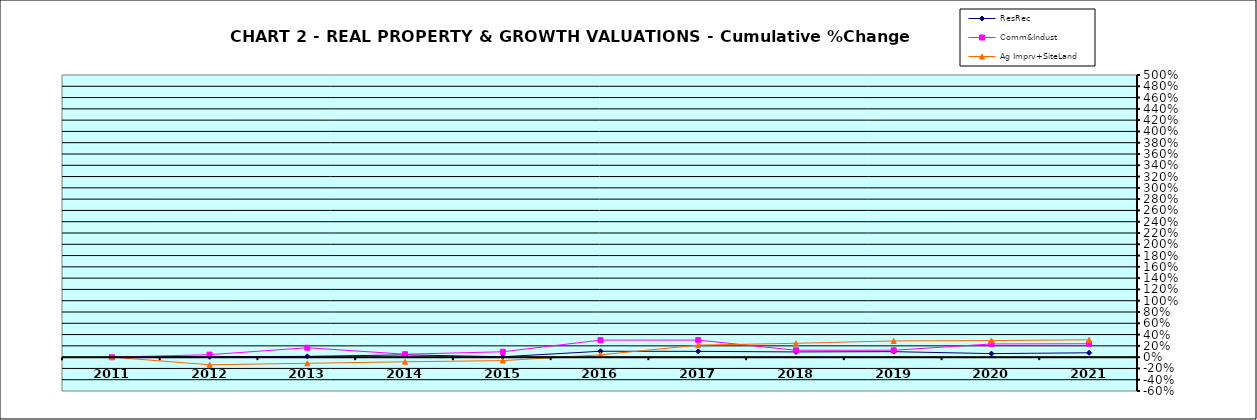
| Category | ResRec | Comm&Indust | Ag Imprv+SiteLand |
|---|---|---|---|
| 2011.0 | -0.001 | -0.001 | 0 |
| 2012.0 | 0.006 | 0.044 | -0.135 |
| 2013.0 | 0.014 | 0.166 | -0.109 |
| 2014.0 | 0.041 | 0.052 | -0.082 |
| 2015.0 | 0.007 | 0.095 | -0.061 |
| 2016.0 | 0.104 | 0.302 | 0.041 |
| 2017.0 | 0.103 | 0.302 | 0.213 |
| 2018.0 | 0.092 | 0.122 | 0.246 |
| 2019.0 | 0.097 | 0.122 | 0.288 |
| 2020.0 | 0.062 | 0.234 | 0.294 |
| 2021.0 | 0.077 | 0.238 | 0.307 |